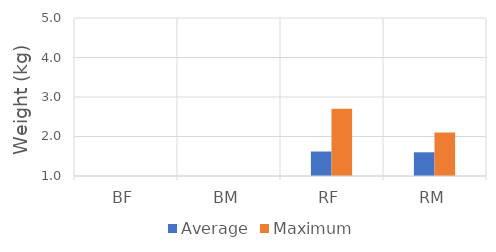
| Category | Average | Maximum |
|---|---|---|
| BF | 0 | 0 |
| BM | 0 | 0 |
| RF | 1.62 | 2.7 |
| RM | 1.6 | 2.1 |